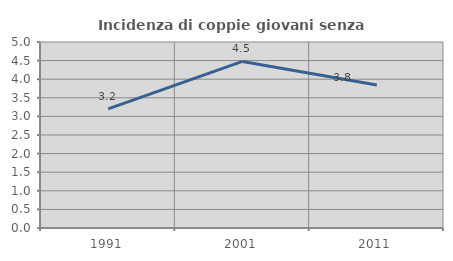
| Category | Incidenza di coppie giovani senza figli |
|---|---|
| 1991.0 | 3.2 |
| 2001.0 | 4.478 |
| 2011.0 | 3.846 |